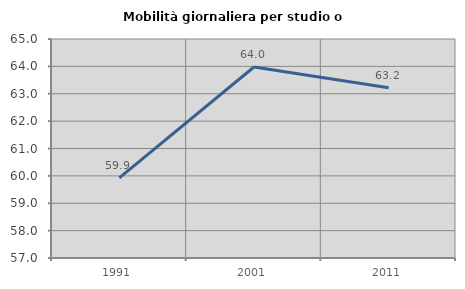
| Category | Mobilità giornaliera per studio o lavoro |
|---|---|
| 1991.0 | 59.927 |
| 2001.0 | 63.978 |
| 2011.0 | 63.219 |